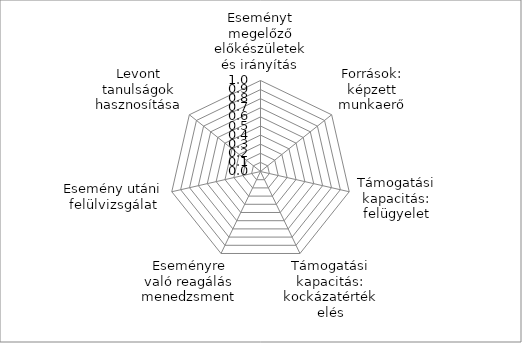
| Category | Series 0 |
|---|---|
| Eseményt megelőző előkészületek és irányítás | 0 |
| Források: képzett munkaerő | 0 |
| Támogatási kapacitás: felügyelet | 0 |
| Támogatási kapacitás: kockázatértékelés | 0 |
| Eseményre való reagálás menedzsment | 0 |
| Esemény utáni felülvizsgálat | 0 |
| Levont tanulságok hasznosítása | 0 |